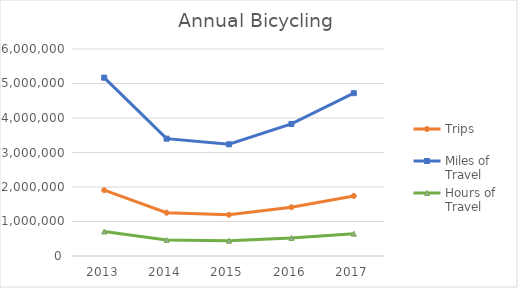
| Category | Trips | Miles of Travel | Hours of Travel |
|---|---|---|---|
| 2013 | 1907061.1 | 5169089.11 | 707809.859 |
| 2014 | 1254774 | 3401064.927 | 465712.089 |
| 2015 | 1194789 | 3238475.585 | 443448.526 |
| 2016 | 1412574 | 3828781.827 | 524279.901 |
| 2017 | 1741156 | 4719403.338 | 646233.822 |